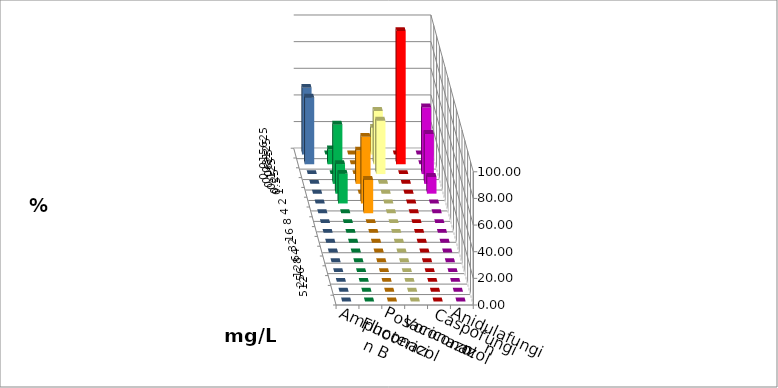
| Category | Amphotericin B | Fluconazol | Posaconazol | Voriconazol | Caspofungin | Anidulafungin |
|---|---|---|---|---|---|---|
| 0.015625 | 0 | 0 | 20 | 0 | 0 | 50 |
| 0.03125 | 11.111 | 0 | 40 | 100 | 0 | 50 |
| 0.0625 | 0 | 0 | 40 | 0 | 50 | 0 |
| 0.125 | 44.444 | 25 | 0 | 0 | 37.5 | 0 |
| 0.25 | 22.222 | 0 | 0 | 0 | 12.5 | 0 |
| 0.5 | 22.222 | 50 | 0 | 0 | 0 | 0 |
| 1.0 | 0 | 25 | 0 | 0 | 0 | 0 |
| 2.0 | 0 | 0 | 0 | 0 | 0 | 0 |
| 4.0 | 0 | 0 | 0 | 0 | 0 | 0 |
| 8.0 | 0 | 0 | 0 | 0 | 0 | 0 |
| 16.0 | 0 | 0 | 0 | 0 | 0 | 0 |
| 32.0 | 0 | 0 | 0 | 0 | 0 | 0 |
| 64.0 | 0 | 0 | 0 | 0 | 0 | 0 |
| 128.0 | 0 | 0 | 0 | 0 | 0 | 0 |
| 256.0 | 0 | 0 | 0 | 0 | 0 | 0 |
| 512.0 | 0 | 0 | 0 | 0 | 0 | 0 |